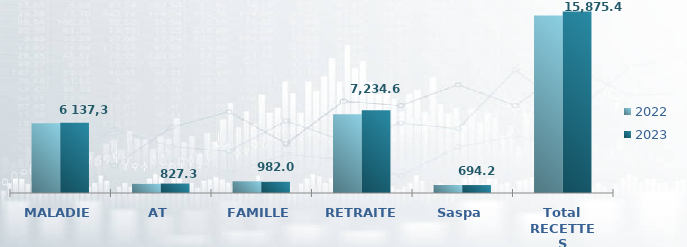
| Category | 2022 | 2023 |
|---|---|---|
| MALADIE | 6106.601 | 6137.247 |
| AT | 800.574 | 827.333 |
| FAMILLE | 1023.514 | 981.955 |
| RETRAITE | 6893.747 | 7234.61 |
| Saspa | 697.76 | 694.207 |
| Total RECETTES | 15522.196 | 15875.353 |